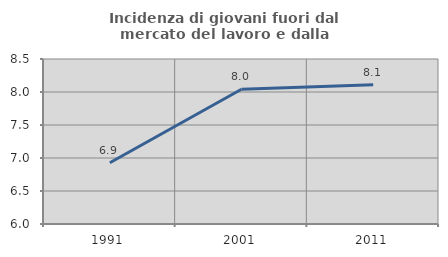
| Category | Incidenza di giovani fuori dal mercato del lavoro e dalla formazione  |
|---|---|
| 1991.0 | 6.929 |
| 2001.0 | 8.042 |
| 2011.0 | 8.11 |